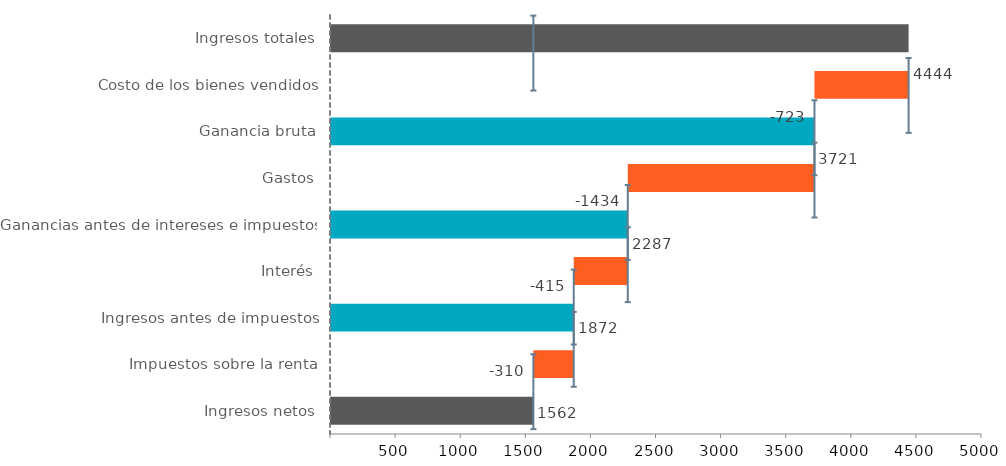
| Category | Extremos | Blanco | Pérdida negativa | Ganancia negativa | Pérdida positiva | Ganancia positiva |
|---|---|---|---|---|---|---|
| Ingresos totales | 4444 | 0 | 0 | 0 | 0 | 0 |
| Costo de los bienes vendidos | 0 | 3721 | 0 | 0 | 723 | 0 |
| Ganancia bruta | 3721 | 0 | 0 | 0 | 0 | 0 |
| Gastos | 0 | 2287 | 0 | 0 | 1434 | 0 |
| Ganancias antes de intereses e impuestos | 2287 | 0 | 0 | 0 | 0 | 0 |
| Interés | 0 | 1872 | 0 | 0 | 415 | 0 |
| Ingresos antes de impuestos | 1872 | 0 | 0 | 0 | 0 | 0 |
| Impuestos sobre la renta | 0 | 1562 | 0 | 0 | 310 | 0 |
| Ingresos netos | 1562 | 0 | 0 | 0 | 0 | 0 |